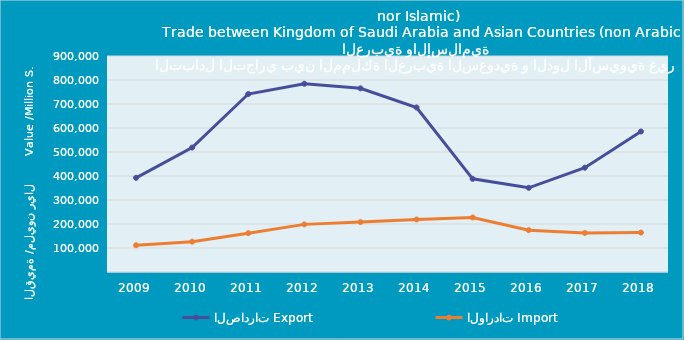
| Category | الصادرات | الواردات |
|---|---|---|
| 2009.0 | 392472518503 | 111491852251 |
| 2010.0 | 518558255953 | 126340214000 |
| 2011.0 | 741564088895 | 161858633935 |
| 2012.0 | 784396925075 | 198437718217 |
| 2013.0 | 765253434045 | 207926807414 |
| 2014.0 | 685488904447 | 218830075159 |
| 2015.0 | 388133411072 | 227280076573 |
| 2016.0 | 350738691172 | 174404286684 |
| 2017.0 | 434618930097 | 162681670861 |
| 2018.0 | 585406686743 | 164250966196 |